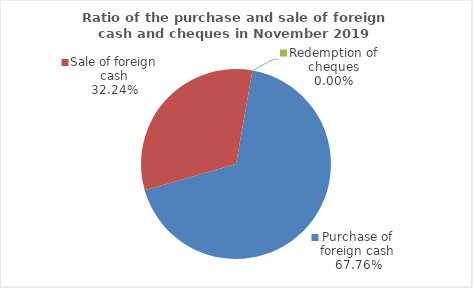
| Category | Series 0 |
|---|---|
| Purchase of foreign cash | 67.762 |
| Sale of foreign cash | 32.238 |
| Redemption of cheques | 0 |